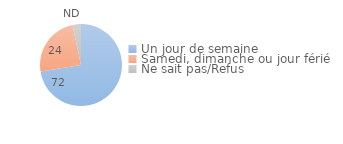
| Category | Series 0 |
|---|---|
| Un jour de semaine | 72.491 |
| Samedi, dimanche ou jour férié | 24.2 |
| Ne sait pas/Refus | 3.309 |